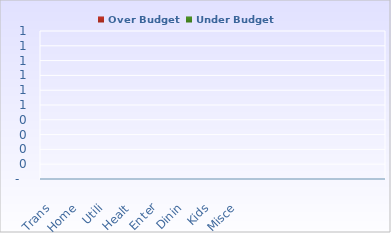
| Category | Over Budget | Under Budget |
|---|---|---|
| Trans | 0 | 0 |
| Home | 0 | 0 |
| Utili | 0 | 0 |
| Healt | 0 | 0 |
| Enter | 0 | 0 |
| Dinin | 0 | 0 |
| Kids | 0 | 0 |
| Misce | 0 | 0 |